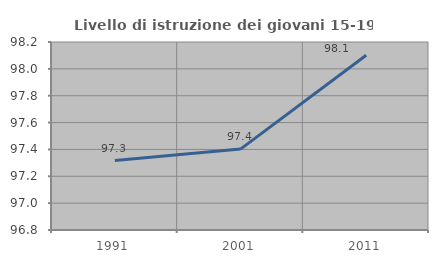
| Category | Livello di istruzione dei giovani 15-19 anni |
|---|---|
| 1991.0 | 97.317 |
| 2001.0 | 97.403 |
| 2011.0 | 98.101 |